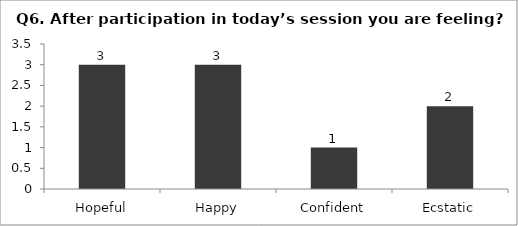
| Category | Q6. After participation in today’s session you are feeling? |
|---|---|
| Hopeful | 3 |
| Happy | 3 |
| Confident | 1 |
| Ecstatic | 2 |